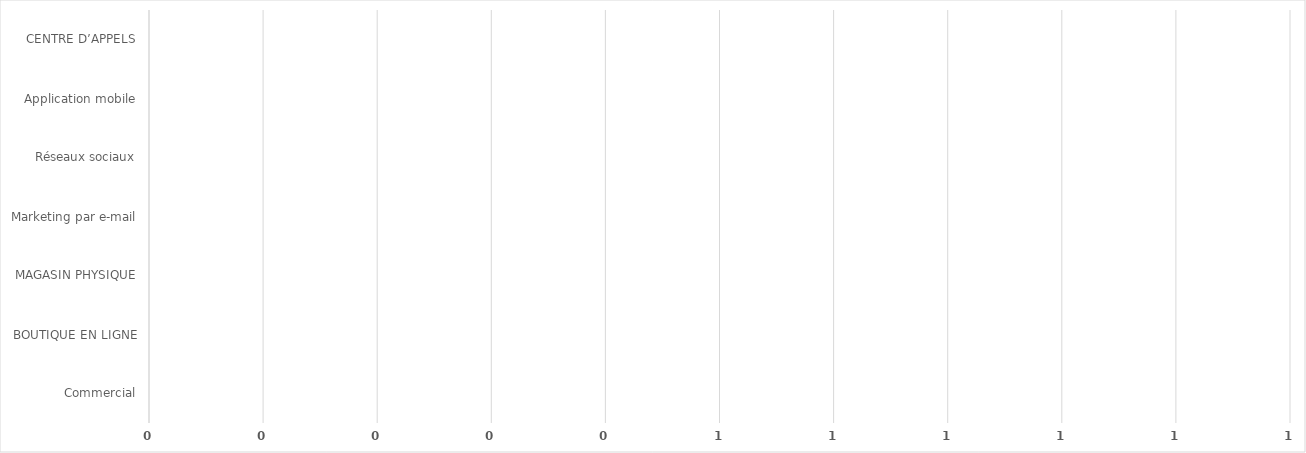
| Category | Series 0 |
|---|---|
| Commercial | 0 |
| BOUTIQUE EN LIGNE | 0 |
| MAGASIN PHYSIQUE | 0 |
| Marketing par e-mail | 0 |
| Réseaux sociaux | 0 |
| Application mobile | 0 |
| CENTRE D’APPELS | 0 |